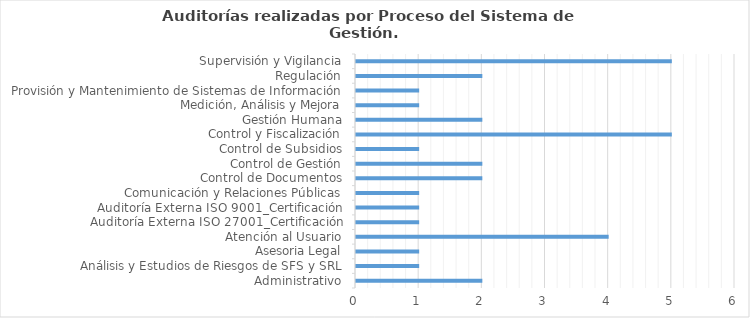
| Category | Total |
|---|---|
| Administrativo | 2 |
| Análisis y Estudios de Riesgos de SFS y SRL | 1 |
| Asesoria Legal | 1 |
| Atención al Usuario | 4 |
| Auditoría Externa ISO 27001_Certificación | 1 |
| Auditoría Externa ISO 9001_Certificación | 1 |
| Comunicación y Relaciones Públicas | 1 |
| Control de Documentos | 2 |
| Control de Gestión | 2 |
| Control de Subsidios | 1 |
| Control y Fiscalización | 5 |
| Gestión Humana | 2 |
| Medición, Análisis y Mejora | 1 |
| Provisión y Mantenimiento de Sistemas de Información | 1 |
| Regulación | 2 |
| Supervisión y Vigilancia | 5 |